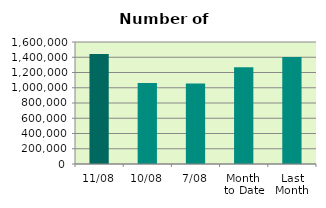
| Category | Series 0 |
|---|---|
| 11/08 | 1444096 |
| 10/08 | 1062578 |
| 7/08 | 1055304 |
| Month 
to Date | 1269466 |
| Last
Month | 1404253.739 |